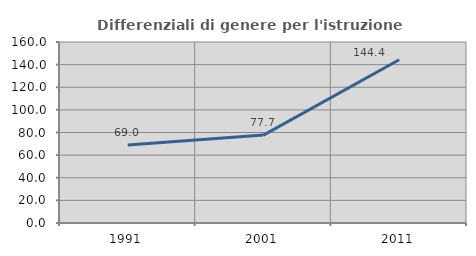
| Category | Differenziali di genere per l'istruzione superiore |
|---|---|
| 1991.0 | 68.966 |
| 2001.0 | 77.728 |
| 2011.0 | 144.361 |